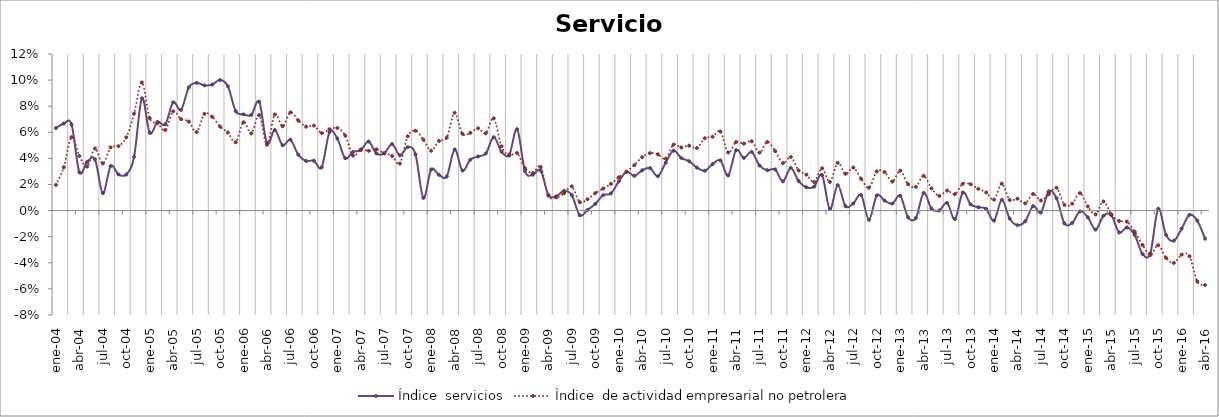
| Category | Índice  servicios | Índice  de actividad empresarial no petrolera |
|---|---|---|
| 2004-01-01 | 0.063 | 0.02 |
| 2004-02-01 | 0.067 | 0.033 |
| 2004-03-01 | 0.066 | 0.056 |
| 2004-04-01 | 0.029 | 0.042 |
| 2004-05-01 | 0.037 | 0.034 |
| 2004-06-01 | 0.039 | 0.048 |
| 2004-07-01 | 0.013 | 0.036 |
| 2004-08-01 | 0.034 | 0.048 |
| 2004-09-01 | 0.028 | 0.049 |
| 2004-10-01 | 0.028 | 0.056 |
| 2004-11-01 | 0.041 | 0.074 |
| 2004-12-01 | 0.086 | 0.098 |
| 2005-01-01 | 0.06 | 0.071 |
| 2005-02-01 | 0.068 | 0.067 |
| 2005-03-01 | 0.066 | 0.062 |
| 2005-04-01 | 0.083 | 0.076 |
| 2005-05-01 | 0.077 | 0.07 |
| 2005-06-01 | 0.094 | 0.068 |
| 2005-07-01 | 0.098 | 0.06 |
| 2005-08-01 | 0.096 | 0.074 |
| 2005-09-01 | 0.097 | 0.072 |
| 2005-10-01 | 0.1 | 0.064 |
| 2005-11-01 | 0.095 | 0.06 |
| 2005-12-01 | 0.076 | 0.052 |
| 2006-01-01 | 0.074 | 0.068 |
| 2006-02-01 | 0.073 | 0.059 |
| 2006-03-01 | 0.083 | 0.073 |
| 2006-04-01 | 0.052 | 0.051 |
| 2006-05-01 | 0.062 | 0.074 |
| 2006-06-01 | 0.05 | 0.065 |
| 2006-07-01 | 0.054 | 0.075 |
| 2006-08-01 | 0.043 | 0.069 |
| 2006-09-01 | 0.038 | 0.064 |
| 2006-10-01 | 0.038 | 0.065 |
| 2006-11-01 | 0.033 | 0.059 |
| 2006-12-01 | 0.06 | 0.062 |
| 2007-01-01 | 0.055 | 0.063 |
| 2007-02-01 | 0.04 | 0.058 |
| 2007-03-01 | 0.045 | 0.042 |
| 2007-04-01 | 0.046 | 0.047 |
| 2007-05-01 | 0.053 | 0.046 |
| 2007-06-01 | 0.044 | 0.047 |
| 2007-07-01 | 0.044 | 0.044 |
| 2007-08-01 | 0.051 | 0.042 |
| 2007-09-01 | 0.042 | 0.036 |
| 2007-10-01 | 0.049 | 0.057 |
| 2007-11-01 | 0.043 | 0.061 |
| 2007-12-01 | 0.01 | 0.054 |
| 2008-01-01 | 0.031 | 0.046 |
| 2008-02-01 | 0.027 | 0.053 |
| 2008-03-01 | 0.026 | 0.056 |
| 2008-04-01 | 0.047 | 0.075 |
| 2008-05-01 | 0.031 | 0.059 |
| 2008-06-01 | 0.039 | 0.06 |
| 2008-07-01 | 0.041 | 0.063 |
| 2008-08-01 | 0.044 | 0.059 |
| 2008-09-01 | 0.056 | 0.071 |
| 2008-10-01 | 0.045 | 0.049 |
| 2008-11-01 | 0.043 | 0.042 |
| 2008-12-01 | 0.062 | 0.044 |
| 2009-01-01 | 0.03 | 0.033 |
| 2009-02-01 | 0.027 | 0.029 |
| 2009-03-01 | 0.031 | 0.033 |
| 2009-04-01 | 0.012 | 0.012 |
| 2009-05-01 | 0.011 | 0.01 |
| 2009-06-01 | 0.015 | 0.013 |
| 2009-07-01 | 0.012 | 0.019 |
| 2009-08-01 | -0.004 | 0.006 |
| 2009-09-01 | 0 | 0.009 |
| 2009-10-01 | 0.005 | 0.013 |
| 2009-11-01 | 0.012 | 0.017 |
| 2009-12-01 | 0.013 | 0.02 |
| 2010-01-01 | 0.022 | 0.026 |
| 2010-02-01 | 0.03 | 0.03 |
| 2010-03-01 | 0.027 | 0.035 |
| 2010-04-01 | 0.031 | 0.041 |
| 2010-05-01 | 0.033 | 0.044 |
| 2010-06-01 | 0.026 | 0.043 |
| 2010-07-01 | 0.037 | 0.04 |
| 2010-08-01 | 0.046 | 0.051 |
| 2010-09-01 | 0.04 | 0.048 |
| 2010-10-01 | 0.038 | 0.05 |
| 2010-11-01 | 0.033 | 0.048 |
| 2010-12-01 | 0.031 | 0.055 |
| 2011-01-01 | 0.036 | 0.057 |
| 2011-02-01 | 0.039 | 0.061 |
| 2011-03-01 | 0.027 | 0.045 |
| 2011-04-01 | 0.046 | 0.053 |
| 2011-05-01 | 0.04 | 0.051 |
| 2011-06-01 | 0.045 | 0.053 |
| 2011-07-01 | 0.035 | 0.044 |
| 2011-08-01 | 0.031 | 0.053 |
| 2011-09-01 | 0.032 | 0.046 |
| 2011-10-01 | 0.022 | 0.036 |
| 2011-11-01 | 0.033 | 0.041 |
| 2011-12-01 | 0.023 | 0.031 |
| 2012-01-01 | 0.018 | 0.028 |
| 2012-02-01 | 0.018 | 0.022 |
| 2012-03-01 | 0.027 | 0.032 |
| 2012-04-01 | 0.001 | 0.022 |
| 2012-05-01 | 0.02 | 0.037 |
| 2012-06-01 | 0.003 | 0.028 |
| 2012-07-01 | 0.005 | 0.033 |
| 2012-08-01 | 0.012 | 0.024 |
| 2012-09-01 | -0.007 | 0.018 |
| 2012-10-01 | 0.012 | 0.03 |
| 2012-11-01 | 0.008 | 0.03 |
| 2012-12-01 | 0.005 | 0.022 |
| 2013-01-01 | 0.011 | 0.031 |
| 2013-02-01 | -0.005 | 0.02 |
| 2013-03-01 | -0.006 | 0.018 |
| 2013-04-01 | 0.014 | 0.027 |
| 2013-05-01 | 0.002 | 0.017 |
| 2013-06-01 | 0 | 0.011 |
| 2013-07-01 | 0.006 | 0.015 |
| 2013-08-01 | -0.007 | 0.013 |
| 2013-09-01 | 0.014 | 0.021 |
| 2013-10-01 | 0.005 | 0.02 |
| 2013-11-01 | 0.003 | 0.017 |
| 2013-12-01 | 0.001 | 0.014 |
| 2014-01-01 | -0.008 | 0.008 |
| 2014-02-01 | 0.008 | 0.021 |
| 2014-03-01 | -0.006 | 0.008 |
| 2014-04-01 | -0.011 | 0.009 |
| 2014-05-01 | -0.008 | 0.006 |
| 2014-06-01 | 0.003 | 0.013 |
| 2014-07-01 | -0.001 | 0.008 |
| 2014-08-01 | 0.015 | 0.013 |
| 2014-09-01 | 0.01 | 0.017 |
| 2014-10-01 | -0.01 | 0.004 |
| 2014-11-01 | -0.01 | 0.005 |
| 2014-12-01 | 0 | 0.013 |
| 2015-01-01 | -0.005 | 0.003 |
| 2015-02-01 | -0.015 | -0.003 |
| 2015-03-01 | -0.004 | 0.007 |
| 2015-04-01 | -0.003 | -0.003 |
| 2015-05-01 | -0.017 | -0.008 |
| 2015-06-01 | -0.013 | -0.008 |
| 2015-07-01 | -0.019 | -0.016 |
| 2015-08-01 | -0.033 | -0.026 |
| 2015-09-01 | -0.033 | -0.034 |
| 2015-10-01 | 0.001 | -0.027 |
| 2015-11-01 | -0.019 | -0.036 |
| 2015-12-01 | -0.023 | -0.04 |
| 2016-01-01 | -0.014 | -0.034 |
| 2016-02-01 | -0.003 | -0.035 |
| 2016-03-01 | -0.008 | -0.054 |
| 2016-04-01 | -0.021 | -0.057 |